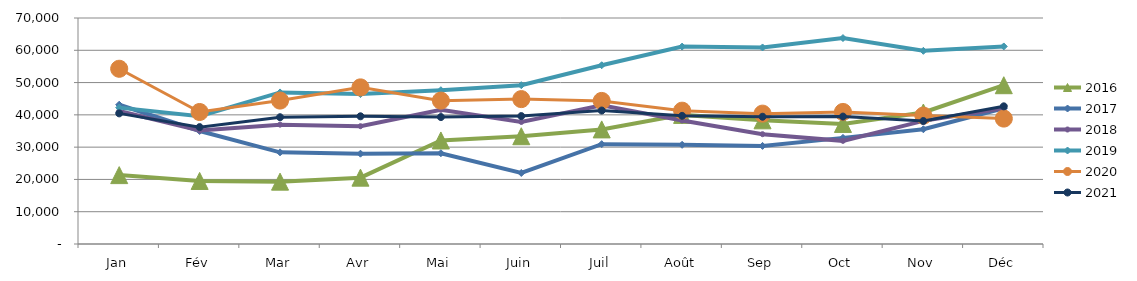
| Category | 2015 | 2016 | 2017 | 2018 | 2019 | 2020 | 2021 |
|---|---|---|---|---|---|---|---|
| Jan |  | 21335.134 | 43138.429 | 41189.736 | 42238.432 | 54273.068 | 40458.51 |
| Fév |  | 19532.337 | 35009.004 | 35137.047 | 39568.195 | 40883.319 | 36200.926 |
| Mar |  | 19313.57 | 28389.673 | 36966.816 | 46942.202 | 44426.392 | 39262.158 |
| Avr |  | 20550.618 | 27972.802 | 36485.223 | 46427.766 | 48509.843 | 39555.16 |
| Mai |  | 32066.609 | 28116.194 | 41558.724 | 47634.031 | 44407.424 | 39315.181 |
| Juin |  | 33383.309 | 22002.869 | 37797.134 | 49186.221 | 44874.513 | 39615.13 |
| Juil |  | 35495.63 | 30926.131 | 42927.847 | 55367.883 | 44316.236 | 41338.163 |
| Août |  | 39992.765 | 30717.708 | 38263.165 | 61146.365 | 41285.559 | 39690.432 |
| Sep |  | 38306.611 | 30378.863 | 34011.672 | 60874.85 | 40379.909 | 39412.556 |
| Oct |  | 37188.976 | 32868.78 | 31946.792 | 63789.634 | 40903.528 | 39474.624 |
| Nov |  | 40729.636 | 35537.079 | 38139.513 | 59829.208 | 39772.437 | 38089.775 |
| Déc |  | 49180.232 | 42040.249 | 42064.579 | 61190.831 | 38851.183 | 42639.837 |